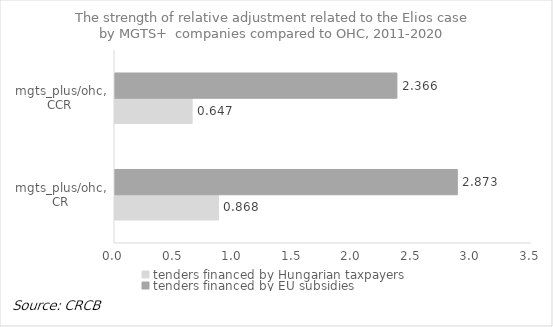
| Category | tenders financed by Hungarian taxpayers | tenders financed by EU subsidies |
|---|---|---|
| mgts_plus/ohc, CR | 0.868 | 2.873 |
| mgts_plus/ohc, CCR | 0.647 | 2.366 |